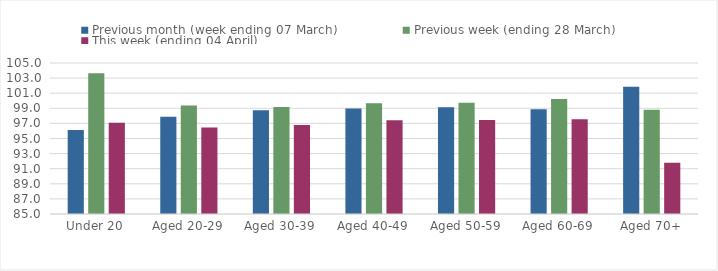
| Category | Previous month (week ending 07 March) | Previous week (ending 28 March) | This week (ending 04 April) |
|---|---|---|---|
| Under 20 | 96.11 | 103.648 | 97.079 |
| Aged 20-29 | 97.895 | 99.367 | 96.455 |
| Aged 30-39 | 98.755 | 99.176 | 96.783 |
| Aged 40-49 | 98.963 | 99.676 | 97.42 |
| Aged 50-59 | 99.143 | 99.73 | 97.466 |
| Aged 60-69 | 98.875 | 100.241 | 97.552 |
| Aged 70+ | 101.843 | 98.804 | 91.776 |